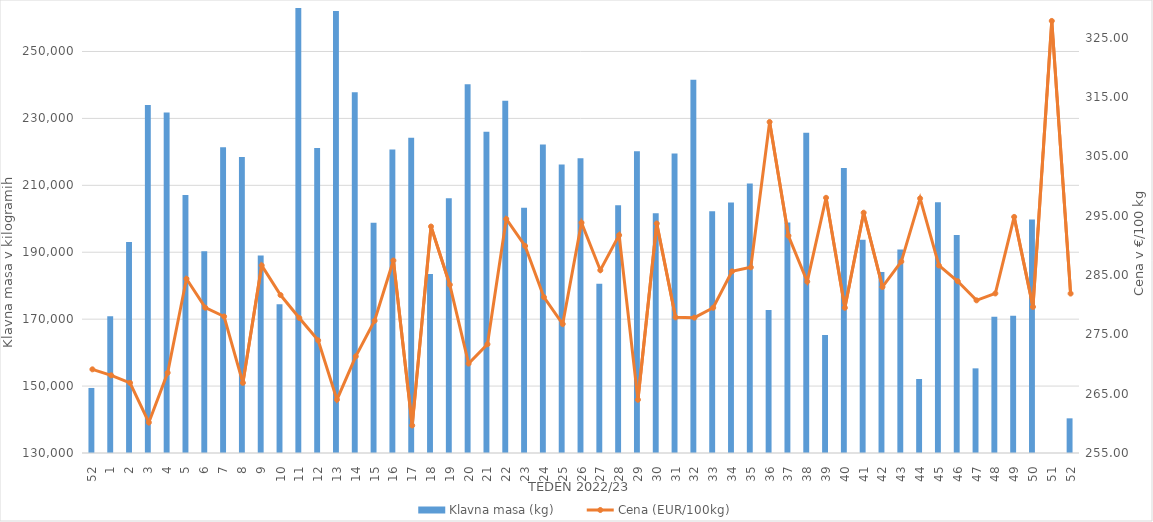
| Category | Klavna masa (kg) |
|---|---|
| 52.0 | 149439 |
| 1.0 | 170843 |
| 2.0 | 193093 |
| 3.0 | 234042 |
| 4.0 | 231737 |
| 5.0 | 207136 |
| 6.0 | 190311 |
| 7.0 | 221366 |
| 8.0 | 218470 |
| 9.0 | 189006 |
| 10.0 | 174425 |
| 11.0 | 265476 |
| 12.0 | 221171 |
| 13.0 | 262102 |
| 14.0 | 237813 |
| 15.0 | 198828 |
| 16.0 | 220686 |
| 17.0 | 224192 |
| 18.0 | 183508 |
| 19.0 | 206133 |
| 20.0 | 240223 |
| 21.0 | 226050 |
| 22.0 | 235273 |
| 23.0 | 203306 |
| 24.0 | 222178 |
| 25.0 | 216259 |
| 26.0 | 218064 |
| 27.0 | 180556 |
| 28.0 | 204078 |
| 29.0 | 220162 |
| 30.0 | 201649 |
| 31.0 | 219538 |
| 32.0 | 241549 |
| 33.0 | 202261 |
| 34.0 | 204903 |
| 35.0 | 210575 |
| 36.0 | 172745 |
| 37.0 | 198877 |
| 38.0 | 225730 |
| 39.0 | 165273 |
| 40.0 | 215175 |
| 41.0 | 193769 |
| 42.0 | 184122 |
| 43.0 | 190834 |
| 44.0 | 152119 |
| 45.0 | 204974 |
| 46.0 | 195179 |
| 47.0 | 155300 |
| 48.0 | 170687 |
| 49.0 | 171040 |
| 50.0 | 199802 |
| 51.0 | 59936 |
| 52.0 | 140361 |